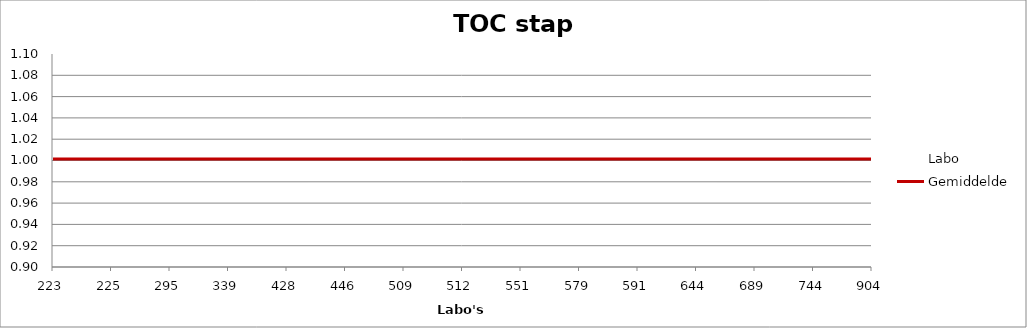
| Category | Labo | Gemiddelde |
|---|---|---|
| 223.0 | 0.957 | 1.001 |
| 225.0 | 1.043 | 1.001 |
| 295.0 | 0.99 | 1.001 |
| 339.0 | 1.015 | 1.001 |
| 428.0 | 1 | 1.001 |
| 446.0 | 0.997 | 1.001 |
| 509.0 | 0.992 | 1.001 |
| 512.0 | 1.038 | 1.001 |
| 551.0 | 1.035 | 1.001 |
| 579.0 | 0.97 | 1.001 |
| 591.0 | 1.053 | 1.001 |
| 644.0 | 0.985 | 1.001 |
| 689.0 | 0.952 | 1.001 |
| 744.0 | 1.01 | 1.001 |
| 904.0 | 0.985 | 1.001 |